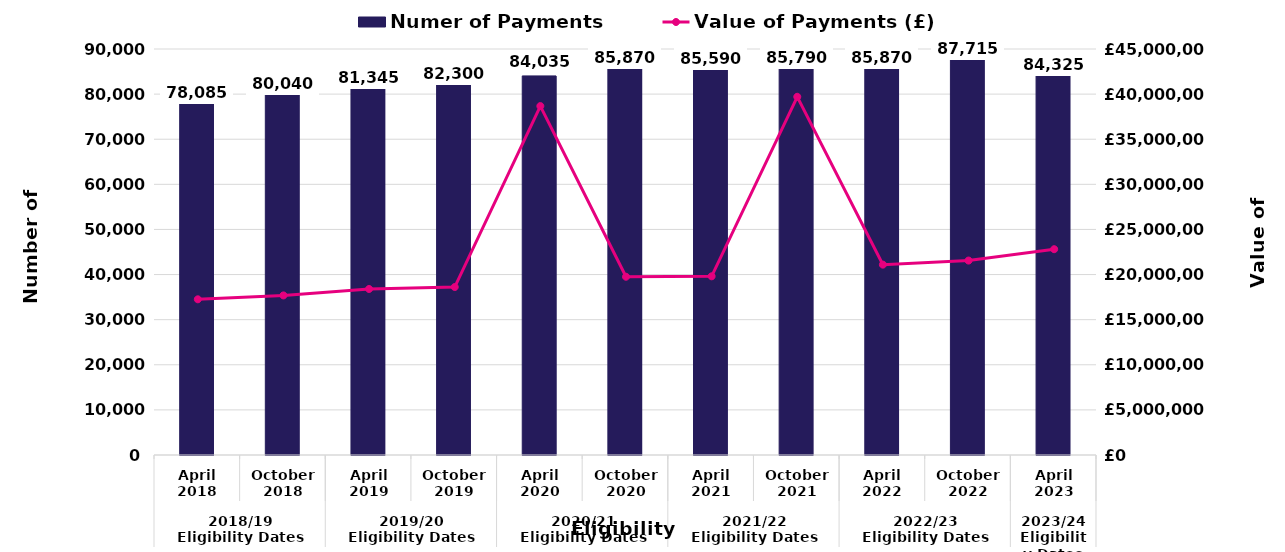
| Category | Numer of Payments |
|---|---|
| 0 | 78085 |
| 1 | 80040 |
| 2 | 81345 |
| 3 | 82300 |
| 4 | 84035 |
| 5 | 85870 |
| 6 | 85590 |
| 7 | 85790 |
| 8 | 85870 |
| 9 | 87715 |
| 10 | 84325 |